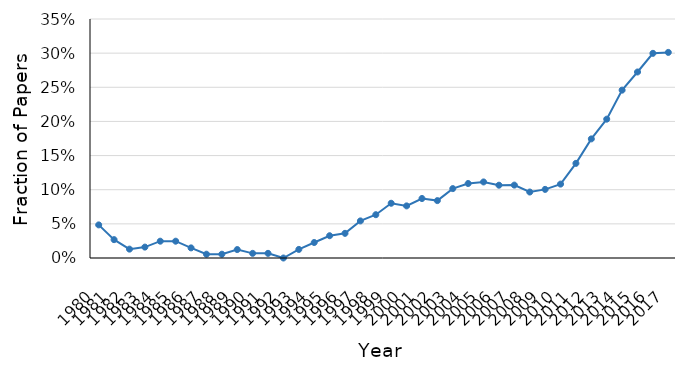
| Category | Administrative Data |
|---|---|
| 1980.0 | 0.048 |
| 1981.0 | 0.027 |
| 1982.0 | 0.013 |
| 1983.0 | 0.016 |
| 1984.0 | 0.025 |
| 1985.0 | 0.025 |
| 1986.0 | 0.015 |
| 1987.0 | 0.006 |
| 1988.0 | 0.006 |
| 1989.0 | 0.012 |
| 1990.0 | 0.007 |
| 1991.0 | 0.007 |
| 1992.0 | 0 |
| 1993.0 | 0.013 |
| 1994.0 | 0.023 |
| 1995.0 | 0.033 |
| 1996.0 | 0.036 |
| 1997.0 | 0.054 |
| 1998.0 | 0.063 |
| 1999.0 | 0.08 |
| 2000.0 | 0.076 |
| 2001.0 | 0.087 |
| 2002.0 | 0.084 |
| 2003.0 | 0.102 |
| 2004.0 | 0.109 |
| 2005.0 | 0.111 |
| 2006.0 | 0.107 |
| 2007.0 | 0.107 |
| 2008.0 | 0.097 |
| 2009.0 | 0.1 |
| 2010.0 | 0.108 |
| 2011.0 | 0.139 |
| 2012.0 | 0.174 |
| 2013.0 | 0.203 |
| 2014.0 | 0.246 |
| 2015.0 | 0.272 |
| 2016.0 | 0.3 |
| 2017.0 | 0.301 |